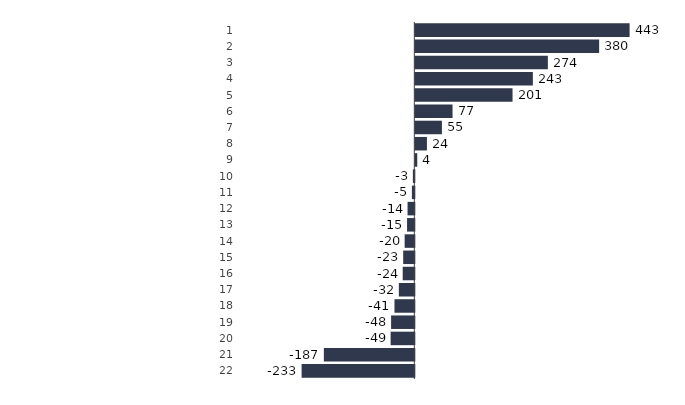
| Category | WZ08 VVJQ abs |
|---|---|
| 0 | 443 |
| 01/01/1900 | 380 |
| 02/01/1900 | 274 |
| 03/01/1900 | 243 |
| 04/01/1900 | 201 |
| 05/01/1900 | 77 |
| 06/01/1900 | 55 |
| 07/01/1900 | 24 |
| 08/01/1900 | 4 |
| 09/01/1900 | -3 |
| 10/01/1900 | -5 |
| 11/01/1900 | -14 |
| 12/01/1900 | -15 |
| 13/01/1900 | -20 |
| 14/01/1900 | -23 |
| 15/01/1900 | -24 |
| 16/01/1900 | -32 |
| 17/01/1900 | -41 |
| 18/01/1900 | -48 |
| 19/01/1900 | -49 |
| 20/01/1900 | -187 |
| 21/01/1900 | -233 |